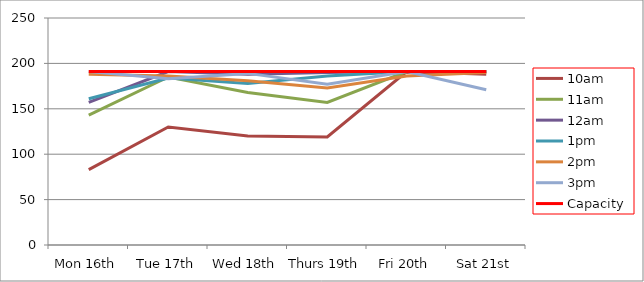
| Category | 9am | 10am | 11am | 12am | 1pm | 2pm | 3pm | 4pm | 5pm | Capacity |
|---|---|---|---|---|---|---|---|---|---|---|
| Mon 16th |  | 83 | 143 | 157 | 161 | 188 | 191 |  |  | 191 |
| Tue 17th |  | 130 | 185 | 191 | 184 | 186 | 183 |  |  | 191 |
| Wed 18th |  | 120 | 168 | 188 | 178 | 181 | 189 |  |  | 191 |
| Thurs 19th |  | 119 | 157 | 190 | 186 | 173 | 177 |  |  | 191 |
| Fri 20th |  | 191 | 191 | 191 | 191 | 186 | 191 |  |  | 191 |
| Sat 21st |  | 188 | 191 | 191 | 191 | 190 | 171 |  |  | 191 |